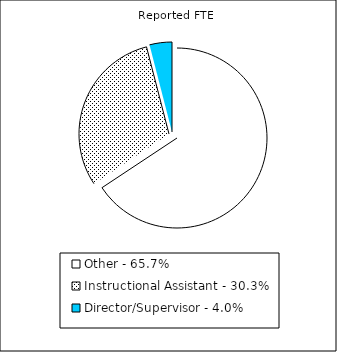
| Category | Reported FTE |
|---|---|
| Other - 65.7% | 29390.08 |
| Instructional Assistant - 30.3% | 13553.23 |
| Director/Supervisor - 4.0% | 1799.78 |